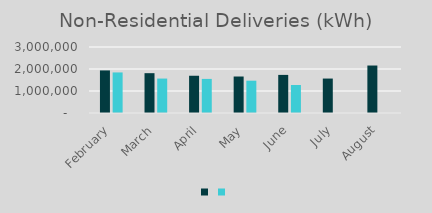
| Category | Series 1 | Series 0 |
|---|---|---|
| February | 1935461 | 1843770 |
| March | 1810164 | 1565360 |
| April | 1693101 | 1549578 |
| May | 1658799 | 1468467 |
| June | 1732026 | 1273660 |
| July | 1565715 | 0 |
| August | 2157982 | 0 |